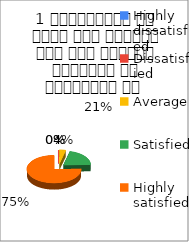
| Category | 1 व्याख्यान से रूचि में वृद्धि हुई एवं शिक्षण जानकारी से परिपूर्ण था  |
|---|---|
| Highly dissatisfied | 0 |
| Dissatisfied | 0 |
| Average | 2 |
| Satisfied | 11 |
| Highly satisfied | 40 |